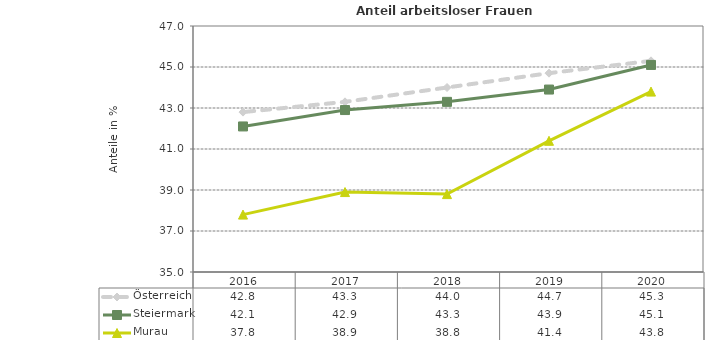
| Category | Österreich | Steiermark | Murau |
|---|---|---|---|
| 2020.0 | 45.3 | 45.1 | 43.8 |
| 2019.0 | 44.7 | 43.9 | 41.4 |
| 2018.0 | 44 | 43.3 | 38.8 |
| 2017.0 | 43.3 | 42.9 | 38.9 |
| 2016.0 | 42.8 | 42.1 | 37.8 |